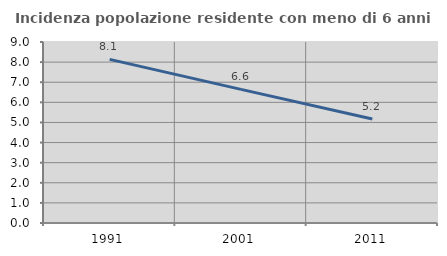
| Category | Incidenza popolazione residente con meno di 6 anni |
|---|---|
| 1991.0 | 8.136 |
| 2001.0 | 6.644 |
| 2011.0 | 5.17 |